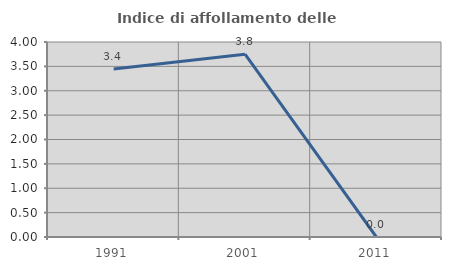
| Category | Indice di affollamento delle abitazioni  |
|---|---|
| 1991.0 | 3.448 |
| 2001.0 | 3.75 |
| 2011.0 | 0 |